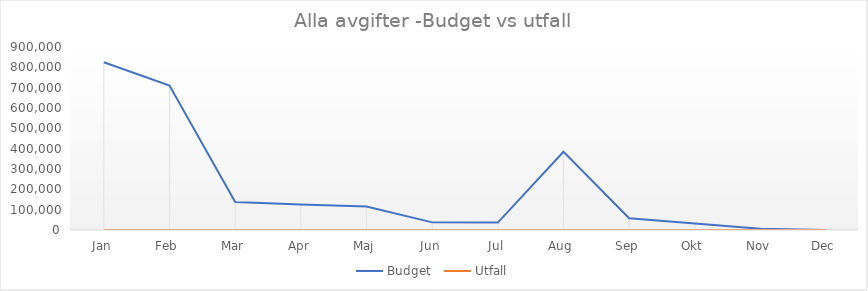
| Category | Budget  | Utfall |
|---|---|---|
| Jan | 825000 | 0 |
| Feb | 710000 | 0 |
| Mar | 138000 | 0 |
| Apr | 126000 | 0 |
| Maj | 116000 | 0 |
| Jun | 37500 | 0 |
| Jul | 36500 | 0 |
| Aug | 385000 | 0 |
| Sep | 58000 | 0 |
| Okt | 32000 | 0 |
| Nov | 6000 | 0 |
| Dec | 0 | 0 |